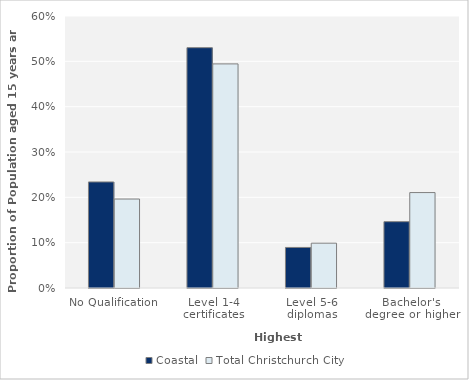
| Category | Coastal | Total Christchurch City |
|---|---|---|
| No Qualification | 0.234 | 0.196 |
| Level 1-4 certificates | 0.53 | 0.494 |
| Level 5-6 diplomas | 0.089 | 0.099 |
| Bachelor's degree or higher | 0.146 | 0.211 |